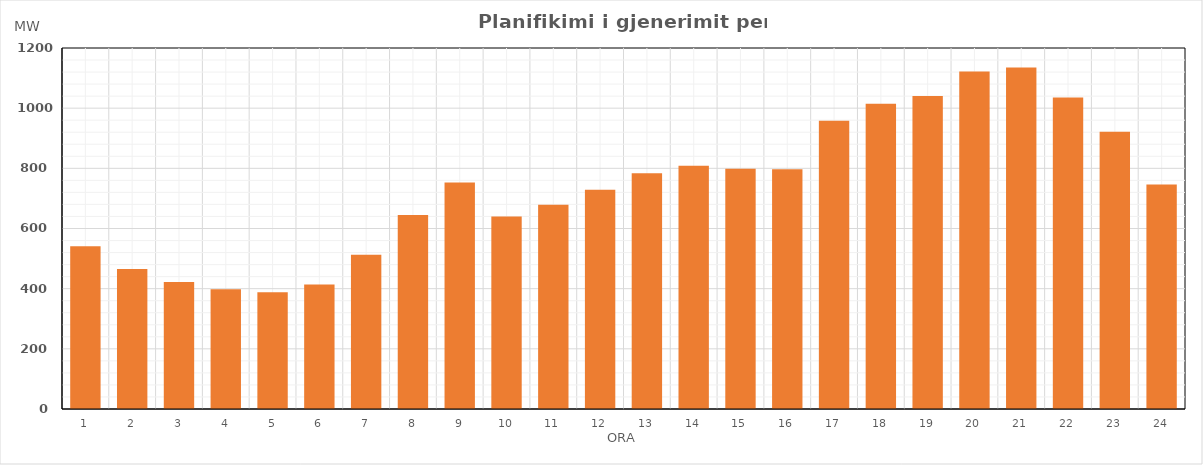
| Category | Max (MW) |
|---|---|
| 0 | 541.15 |
| 1 | 465.04 |
| 2 | 421.94 |
| 3 | 397.9 |
| 4 | 388 |
| 5 | 413.96 |
| 6 | 512.83 |
| 7 | 645.1 |
| 8 | 752.93 |
| 9 | 639.5 |
| 10 | 679.29 |
| 11 | 729.14 |
| 12 | 783.84 |
| 13 | 808.45 |
| 14 | 798.87 |
| 15 | 797.13 |
| 16 | 958.58 |
| 17 | 1014.84 |
| 18 | 1040.6 |
| 19 | 1121.69 |
| 20 | 1134.92 |
| 21 | 1035.14 |
| 22 | 921.25 |
| 23 | 746.23 |